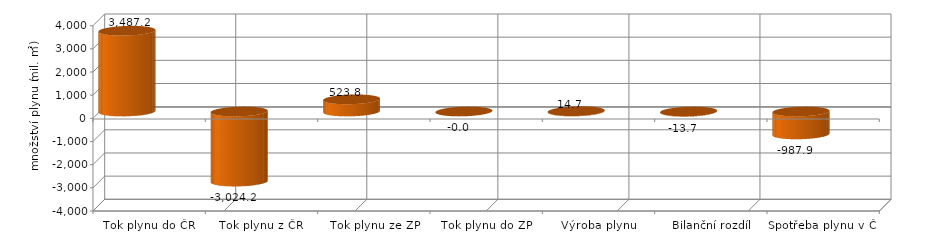
| Category | Series 0 | Series 1 |
|---|---|---|
| Tok plynu do ČR | 3487.243 |  |
| Tok plynu z ČR | -3024.151 |  |
| Tok plynu ze ZP | 523.814 |  |
| Tok plynu do ZP | 0 |  |
| Výroba plynu | 14.691 |  |
| Bilanční rozdíl | -13.745 |  |
| Spotřeba plynu v ČR | -987.852 |  |